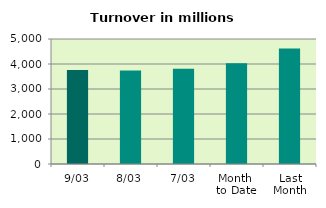
| Category | Series 0 |
|---|---|
| 9/03 | 3761.373 |
| 8/03 | 3739.956 |
| 7/03 | 3805.493 |
| Month 
to Date | 4025.339 |
| Last
Month | 4623.097 |